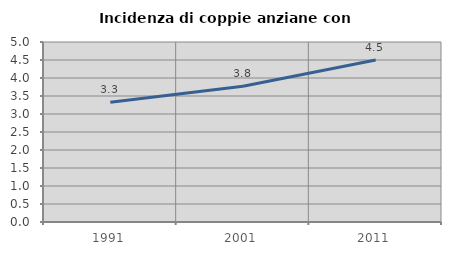
| Category | Incidenza di coppie anziane con figli |
|---|---|
| 1991.0 | 3.328 |
| 2001.0 | 3.77 |
| 2011.0 | 4.498 |